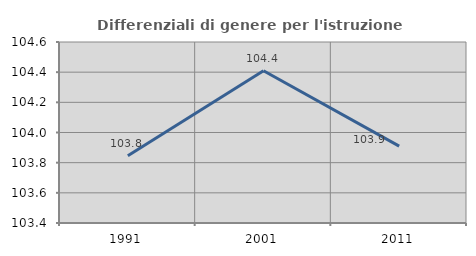
| Category | Differenziali di genere per l'istruzione superiore |
|---|---|
| 1991.0 | 103.846 |
| 2001.0 | 104.409 |
| 2011.0 | 103.909 |